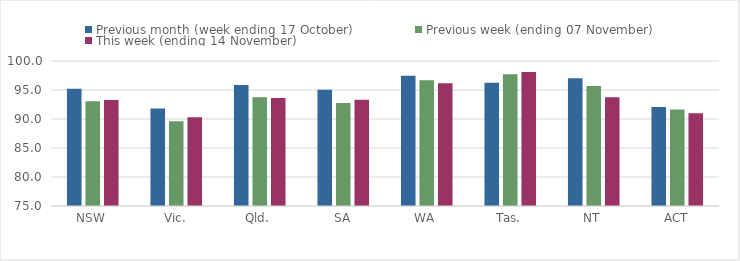
| Category | Previous month (week ending 17 October) | Previous week (ending 07 November) | This week (ending 14 November) |
|---|---|---|---|
| NSW | 95.2 | 93.08 | 93.28 |
| Vic. | 91.8 | 89.6 | 90.31 |
| Qld. | 95.88 | 93.76 | 93.63 |
| SA | 95.06 | 92.78 | 93.32 |
| WA | 97.47 | 96.67 | 96.18 |
| Tas. | 96.23 | 97.7 | 98.1 |
| NT | 97.02 | 95.69 | 93.77 |
| ACT | 92.08 | 91.63 | 91 |